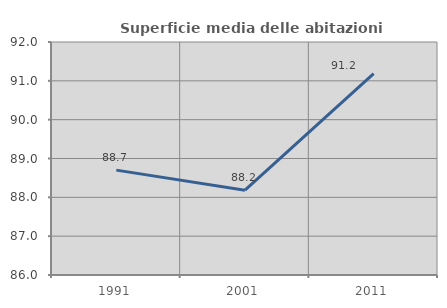
| Category | Superficie media delle abitazioni occupate |
|---|---|
| 1991.0 | 88.701 |
| 2001.0 | 88.184 |
| 2011.0 | 91.187 |